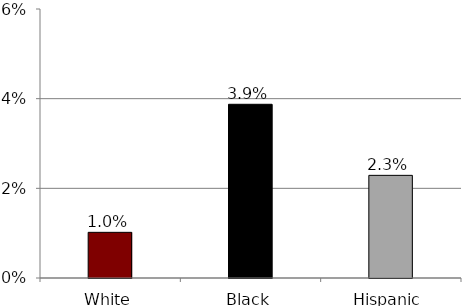
| Category | Series 0 |
|---|---|
| White | 0.01 |
| Black | 0.039 |
| Hispanic | 0.023 |